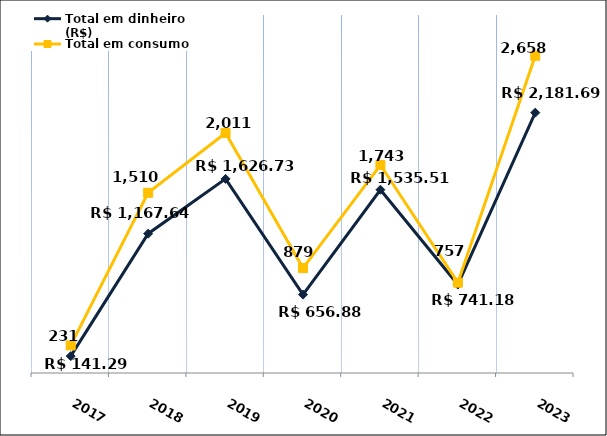
| Category | Total em dinheiro (R$) |
|---|---|
| 2017.0 | 141.29 |
| 2018.0 | 1167.64 |
| 2019.0 | 1626.73 |
| 2020.0 | 656.88 |
| 2021.0 | 1535.51 |
| 2022.0 | 741.18 |
| 2023.0 | 2181.69 |